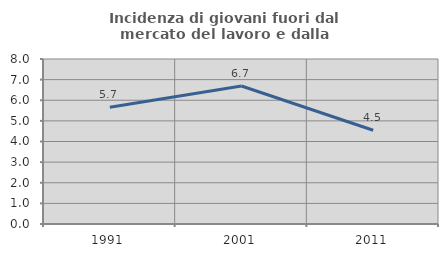
| Category | Incidenza di giovani fuori dal mercato del lavoro e dalla formazione  |
|---|---|
| 1991.0 | 5.656 |
| 2001.0 | 6.689 |
| 2011.0 | 4.545 |